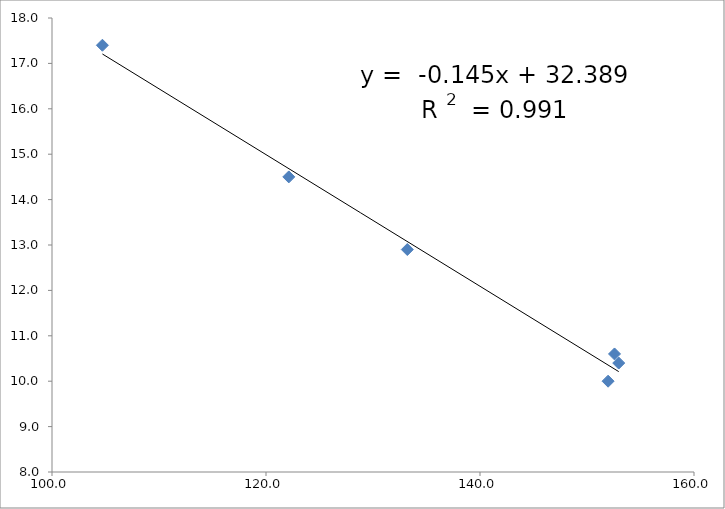
| Category | Series 0 |
|---|---|
| 104.712 | 17.4 |
| 122.131 | 14.5 |
| 133.206 | 12.9 |
| 152.965 | 10.4 |
| 152.572 | 10.6 |
| 151.971 | 10 |